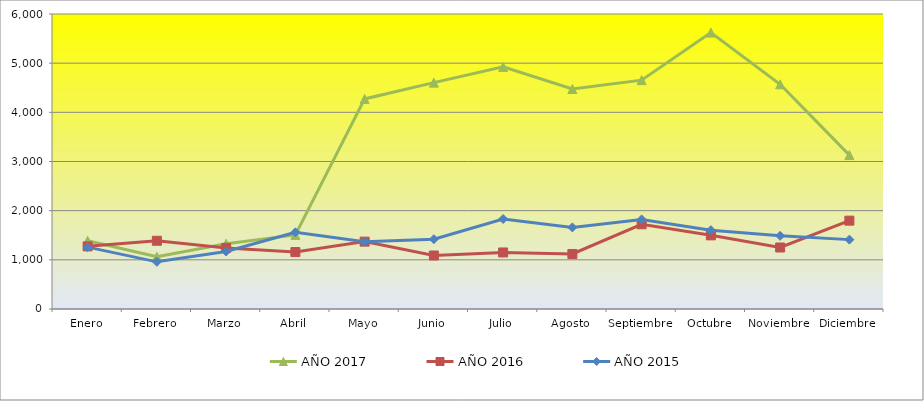
| Category | AÑO 2017 | AÑO 2016 | AÑO 2015 |
|---|---|---|---|
| Enero | 1387.544 | 1274 | 1258 |
| Febrero | 1061.404 | 1388 | 959 |
| Marzo | 1327.719 | 1243 | 1169 |
| Abril | 1507.193 | 1158 | 1559 |
| Mayo | 4272.738 | 1370 | 1370 |
| Junio | 4604.107 | 1088 | 1420 |
| Julio | 4924.167 | 1150 | 1831 |
| Agosto | 4474.048 | 1119 | 1660 |
| Septiembre | 4655 | 1723 | 1822 |
| Octubre | 5621.429 | 1498 | 1604 |
| Noviembre | 4570 | 1251 | 1488 |
| Diciembre | 3130.476 | 1797 | 1411 |